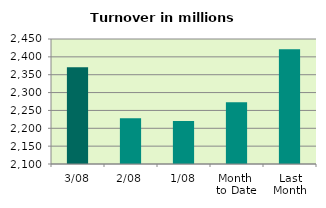
| Category | Series 0 |
|---|---|
| 3/08 | 2371.011 |
| 2/08 | 2228.098 |
| 1/08 | 2220.188 |
| Month 
to Date | 2273.099 |
| Last
Month | 2421.628 |